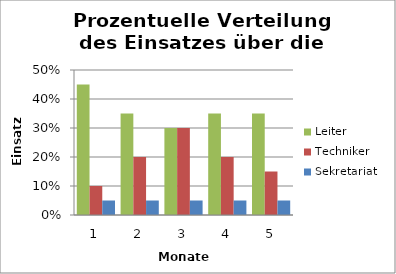
| Category | Leiter | Techniker | Sekretariat |
|---|---|---|---|
| 0 | 0.45 | 0.1 | 0.05 |
| 1 | 0.35 | 0.2 | 0.05 |
| 2 | 0.3 | 0.3 | 0.05 |
| 3 | 0.35 | 0.2 | 0.05 |
| 4 | 0.35 | 0.15 | 0.05 |